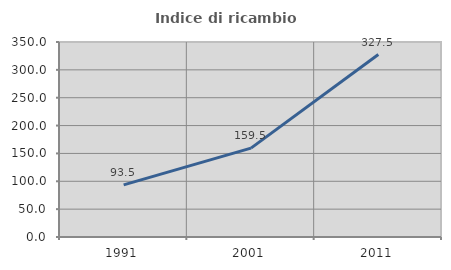
| Category | Indice di ricambio occupazionale  |
|---|---|
| 1991.0 | 93.518 |
| 2001.0 | 159.545 |
| 2011.0 | 327.537 |